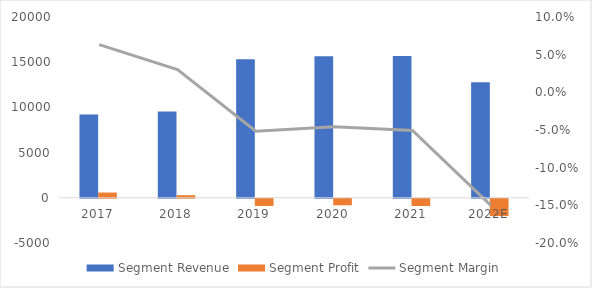
| Category | Segment Revenue | Segment Profit |
|---|---|---|
| 2017 | 9205 | 583 |
| 2018 | 9533 | 287 |
| 2019 | 15337 | -791 |
| 2020 | 15666 | -715 |
| 2021 | 15697 | -795 |
| 2022E | 12769.079 | -1915.362 |